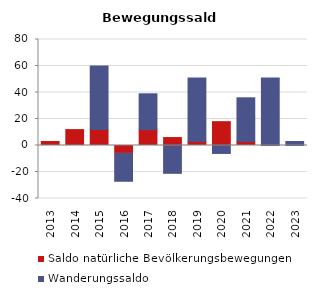
| Category | Saldo natürliche Bevölkerungsbewegungen | Wanderungssaldo |
|---|---|---|
| 2013.0 | 3 | 0 |
| 2014.0 | 12 | 0 |
| 2015.0 | 12 | 48 |
| 2016.0 | -6 | -21 |
| 2017.0 | 12 | 27 |
| 2018.0 | 6 | -21 |
| 2019.0 | 3 | 48 |
| 2020.0 | 18 | -6 |
| 2021.0 | 3 | 33 |
| 2022.0 | 0 | 51 |
| 2023.0 | 0 | 3 |